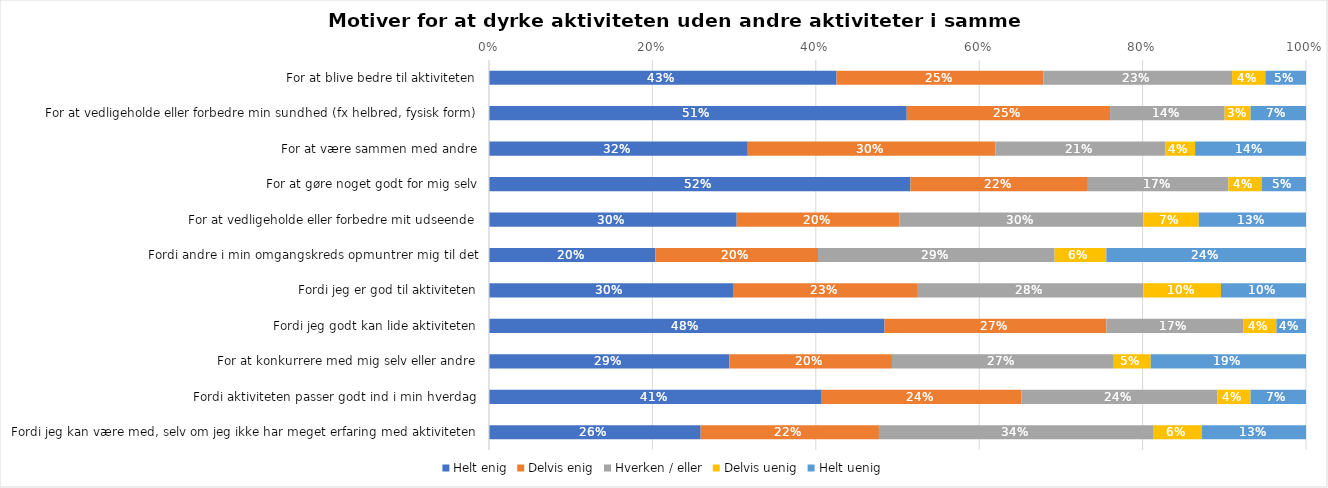
| Category | Helt enig | Delvis enig | Hverken / eller | Delvis uenig | Helt uenig |
|---|---|---|---|---|---|
| For at blive bedre til aktiviteten | 0.425 | 0.253 | 0.231 | 0.041 | 0.05 |
| For at vedligeholde eller forbedre min sundhed (fx helbred, fysisk form) | 0.511 | 0.249 | 0.14 | 0.032 | 0.068 |
| For at være sammen med andre | 0.317 | 0.303 | 0.208 | 0.036 | 0.136 |
| For at gøre noget godt for mig selv | 0.516 | 0.217 | 0.172 | 0.041 | 0.054 |
| For at vedligeholde eller forbedre mit udseende | 0.303 | 0.199 | 0.299 | 0.068 | 0.131 |
| Fordi andre i min omgangskreds opmuntrer mig til det | 0.204 | 0.199 | 0.29 | 0.063 | 0.244 |
| Fordi jeg er god til aktiviteten | 0.299 | 0.226 | 0.276 | 0.095 | 0.104 |
| Fordi jeg godt kan lide aktiviteten | 0.484 | 0.271 | 0.167 | 0.041 | 0.036 |
| For at konkurrere med mig selv eller andre | 0.294 | 0.199 | 0.271 | 0.045 | 0.19 |
| Fordi aktiviteten passer godt ind i min hverdag | 0.407 | 0.244 | 0.24 | 0.041 | 0.068 |
| Fordi jeg kan være med, selv om jeg ikke har meget erfaring med aktiviteten | 0.259 | 0.218 | 0.336 | 0.059 | 0.127 |